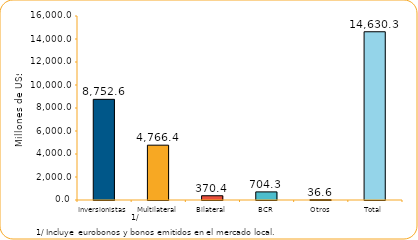
| Category | Series 1 |
|---|---|
| Inversionistas | 8752.6 |
| Multilateral | 4766.4 |
| Bilateral | 370.4 |
| BCR | 704.3 |
| Otros | 36.6 |
| Total | 14630.3 |